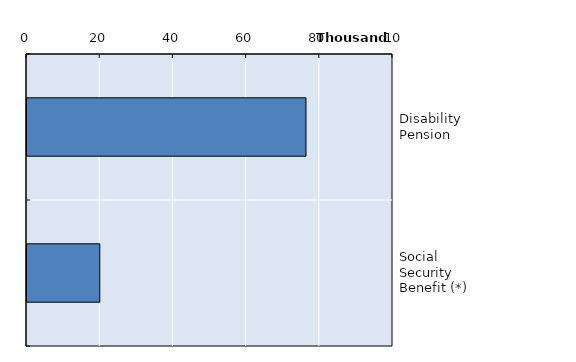
| Category | Series 0 |
|---|---|
| Disability Pension | 76227 |
| Social Security Benefit (*) | 19889 |